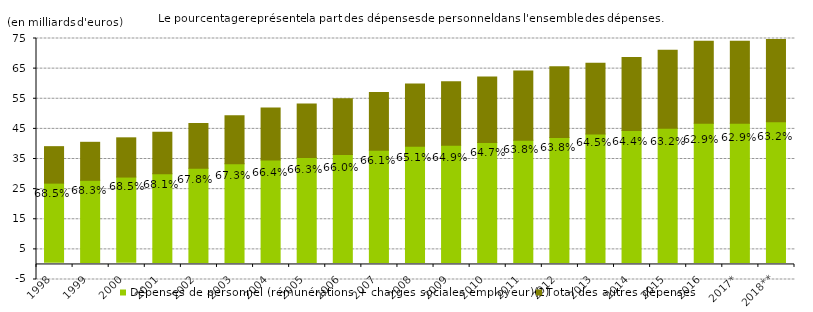
| Category | % | Dépenses de personnel (rémunérations + charges sociales employeur)(1) | Total des autres dépenses |
|---|---|---|---|
| 1998.0 | 0.685 | 26.3 | 12.113 |
| 1999.0 | 0.683 | 27.23 | 12.628 |
| 2000.0 | 0.685 | 28.318 | 13.027 |
| 2001.0 | 0.681 | 29.399 | 13.793 |
| 2002.0 | 0.678 | 31.211 | 14.855 |
| 2003.0 | 0.673 | 32.749 | 15.935 |
| 2004.0 | 0.664 | 34.005 | 17.227 |
| 2005.0 | 0.663 | 34.84 | 17.73 |
| 2006.0 | 0.66 | 35.851 | 18.457 |
| 2007.0 | 0.661 | 37.281 | 19.138 |
| 2008.0 | 0.651 | 38.546 | 20.669 |
| 2009.0 | 0.649 | 38.93 | 21.08 |
| 2010.0 | 0.647 | 39.831 | 21.704 |
| 2011.0 | 0.638 | 40.593 | 23.001 |
| 2012.0 | 0.638 | 41.459 | 23.528 |
| 2013.0 | 0.645 | 42.653 | 23.522 |
| 2014.0 | 0.644 | 43.799 | 24.239 |
| 2015.0 | 0.632 | 44.541 | 25.942 |
| 2016.0 | 0.629 | 46.201 | 27.235 |
| 2017.0 | 0.629 | 46.201 | 27.235 |
| 2018.0 | 0.632 | 46.747 | 27.249 |